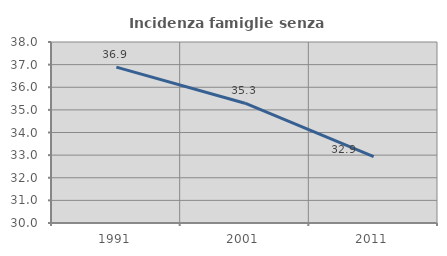
| Category | Incidenza famiglie senza nuclei |
|---|---|
| 1991.0 | 36.891 |
| 2001.0 | 35.294 |
| 2011.0 | 32.929 |